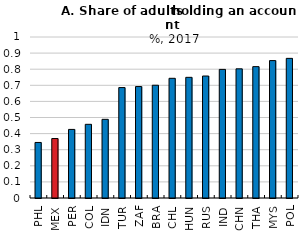
| Category | Series 0 |
|---|---|
| PHL | 0.345 |
| MEX | 0.369 |
| PER | 0.426 |
| COL | 0.458 |
| IDN | 0.489 |
| TUR | 0.686 |
| ZAF | 0.692 |
| BRA | 0.7 |
| CHL | 0.743 |
| HUN | 0.749 |
| RUS | 0.758 |
| IND | 0.799 |
| CHN | 0.802 |
| THA | 0.816 |
| MYS | 0.853 |
| POL | 0.867 |